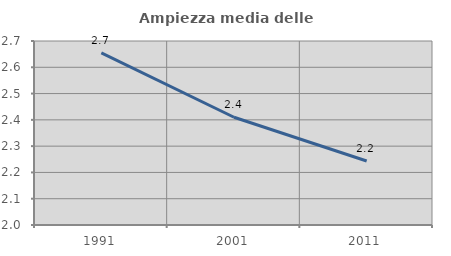
| Category | Ampiezza media delle famiglie |
|---|---|
| 1991.0 | 2.655 |
| 2001.0 | 2.41 |
| 2011.0 | 2.243 |